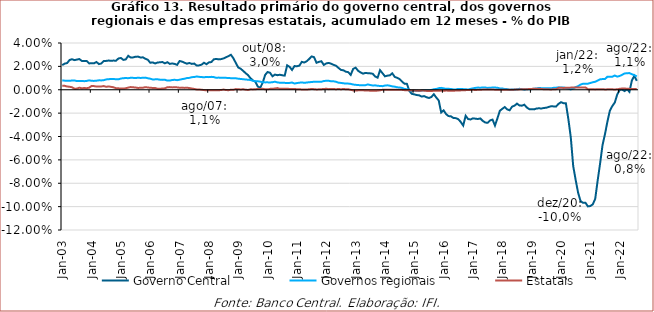
| Category | Governo Central | Governos regionais | Estatais |
|---|---|---|---|
| 2003-01-01 | 0.021 | 0.008 | 0.003 |
| 2003-02-01 | 0.022 | 0.008 | 0.003 |
| 2003-03-01 | 0.023 | 0.008 | 0.003 |
| 2003-04-01 | 0.025 | 0.008 | 0.003 |
| 2003-05-01 | 0.026 | 0.008 | 0.002 |
| 2003-06-01 | 0.025 | 0.008 | 0.001 |
| 2003-07-01 | 0.026 | 0.007 | 0.001 |
| 2003-08-01 | 0.026 | 0.008 | 0.002 |
| 2003-09-01 | 0.025 | 0.008 | 0.001 |
| 2003-10-01 | 0.025 | 0.007 | 0.001 |
| 2003-11-01 | 0.025 | 0.008 | 0.001 |
| 2003-12-01 | 0.023 | 0.008 | 0.002 |
| 2004-01-01 | 0.023 | 0.008 | 0.003 |
| 2004-02-01 | 0.023 | 0.008 | 0.003 |
| 2004-03-01 | 0.024 | 0.008 | 0.003 |
| 2004-04-01 | 0.022 | 0.008 | 0.003 |
| 2004-05-01 | 0.022 | 0.008 | 0.003 |
| 2004-06-01 | 0.025 | 0.008 | 0.003 |
| 2004-07-01 | 0.025 | 0.009 | 0.003 |
| 2004-08-01 | 0.025 | 0.009 | 0.003 |
| 2004-09-01 | 0.025 | 0.009 | 0.002 |
| 2004-10-01 | 0.025 | 0.009 | 0.002 |
| 2004-11-01 | 0.025 | 0.009 | 0.001 |
| 2004-12-01 | 0.027 | 0.009 | 0.001 |
| 2005-01-01 | 0.027 | 0.01 | 0.001 |
| 2005-02-01 | 0.026 | 0.01 | 0.001 |
| 2005-03-01 | 0.026 | 0.01 | 0.001 |
| 2005-04-01 | 0.029 | 0.01 | 0.002 |
| 2005-05-01 | 0.028 | 0.01 | 0.002 |
| 2005-06-01 | 0.028 | 0.01 | 0.002 |
| 2005-07-01 | 0.028 | 0.01 | 0.002 |
| 2005-08-01 | 0.028 | 0.01 | 0.002 |
| 2005-09-01 | 0.028 | 0.01 | 0.002 |
| 2005-10-01 | 0.028 | 0.01 | 0.002 |
| 2005-11-01 | 0.027 | 0.01 | 0.002 |
| 2005-12-01 | 0.026 | 0.01 | 0.002 |
| 2006-01-01 | 0.023 | 0.009 | 0.002 |
| 2006-02-01 | 0.023 | 0.009 | 0.002 |
| 2006-03-01 | 0.023 | 0.009 | 0.002 |
| 2006-04-01 | 0.023 | 0.009 | 0.001 |
| 2006-05-01 | 0.024 | 0.009 | 0.001 |
| 2006-06-01 | 0.024 | 0.008 | 0.001 |
| 2006-07-01 | 0.023 | 0.009 | 0.001 |
| 2006-08-01 | 0.024 | 0.008 | 0.002 |
| 2006-09-01 | 0.022 | 0.008 | 0.002 |
| 2006-10-01 | 0.022 | 0.008 | 0.002 |
| 2006-11-01 | 0.022 | 0.009 | 0.002 |
| 2006-12-01 | 0.021 | 0.008 | 0.002 |
| 2007-01-01 | 0.025 | 0.009 | 0.002 |
| 2007-02-01 | 0.024 | 0.009 | 0.002 |
| 2007-03-01 | 0.023 | 0.009 | 0.002 |
| 2007-04-01 | 0.022 | 0.01 | 0.002 |
| 2007-05-01 | 0.023 | 0.01 | 0.001 |
| 2007-06-01 | 0.022 | 0.011 | 0.001 |
| 2007-07-01 | 0.022 | 0.011 | 0.001 |
| 2007-08-01 | 0.021 | 0.011 | 0 |
| 2007-09-01 | 0.021 | 0.011 | 0 |
| 2007-10-01 | 0.021 | 0.011 | 0 |
| 2007-11-01 | 0.023 | 0.011 | 0 |
| 2007-12-01 | 0.022 | 0.011 | 0 |
| 2008-01-01 | 0.023 | 0.011 | 0 |
| 2008-02-01 | 0.024 | 0.011 | 0 |
| 2008-03-01 | 0.026 | 0.011 | -0.001 |
| 2008-04-01 | 0.026 | 0.01 | -0.001 |
| 2008-05-01 | 0.026 | 0.01 | 0 |
| 2008-06-01 | 0.026 | 0.01 | 0 |
| 2008-07-01 | 0.027 | 0.01 | 0 |
| 2008-08-01 | 0.028 | 0.01 | 0 |
| 2008-09-01 | 0.029 | 0.01 | 0 |
| 2008-10-01 | 0.03 | 0.01 | 0 |
| 2008-11-01 | 0.027 | 0.01 | 0 |
| 2008-12-01 | 0.023 | 0.01 | 0.001 |
| 2009-01-01 | 0.019 | 0.009 | 0 |
| 2009-02-01 | 0.018 | 0.009 | 0 |
| 2009-03-01 | 0.016 | 0.009 | 0 |
| 2009-04-01 | 0.014 | 0.009 | 0 |
| 2009-05-01 | 0.013 | 0.009 | 0 |
| 2009-06-01 | 0.01 | 0.008 | 0 |
| 2009-07-01 | 0.008 | 0.008 | 0 |
| 2009-08-01 | 0.007 | 0.007 | 0 |
| 2009-09-01 | 0.003 | 0.007 | 0.001 |
| 2009-10-01 | 0.002 | 0.007 | 0.001 |
| 2009-11-01 | 0.006 | 0.006 | 0.001 |
| 2009-12-01 | 0.013 | 0.006 | 0 |
| 2010-01-01 | 0.015 | 0.006 | 0 |
| 2010-02-01 | 0.015 | 0.006 | 0.001 |
| 2010-03-01 | 0.012 | 0.006 | 0.001 |
| 2010-04-01 | 0.013 | 0.007 | 0.001 |
| 2010-05-01 | 0.012 | 0.006 | 0.001 |
| 2010-06-01 | 0.013 | 0.006 | 0.001 |
| 2010-07-01 | 0.012 | 0.006 | 0.001 |
| 2010-08-01 | 0.012 | 0.006 | 0.001 |
| 2010-09-01 | 0.021 | 0.006 | 0.001 |
| 2010-10-01 | 0.02 | 0.006 | 0.001 |
| 2010-11-01 | 0.017 | 0.006 | 0.001 |
| 2010-12-01 | 0.02 | 0.005 | 0.001 |
| 2011-01-01 | 0.02 | 0.006 | 0 |
| 2011-02-01 | 0.021 | 0.006 | 0 |
| 2011-03-01 | 0.024 | 0.006 | 0 |
| 2011-04-01 | 0.023 | 0.006 | 0 |
| 2011-05-01 | 0.024 | 0.006 | 0 |
| 2011-06-01 | 0.026 | 0.006 | 0 |
| 2011-07-01 | 0.029 | 0.007 | 0.001 |
| 2011-08-01 | 0.028 | 0.007 | 0.001 |
| 2011-09-01 | 0.023 | 0.007 | 0 |
| 2011-10-01 | 0.024 | 0.007 | 0 |
| 2011-11-01 | 0.024 | 0.007 | 0 |
| 2011-12-01 | 0.021 | 0.008 | 0.001 |
| 2012-01-01 | 0.023 | 0.008 | 0.001 |
| 2012-02-01 | 0.023 | 0.008 | 0.001 |
| 2012-03-01 | 0.022 | 0.007 | 0.001 |
| 2012-04-01 | 0.021 | 0.007 | 0.001 |
| 2012-05-01 | 0.021 | 0.007 | 0 |
| 2012-06-01 | 0.019 | 0.006 | 0.001 |
| 2012-07-01 | 0.017 | 0.006 | 0 |
| 2012-08-01 | 0.017 | 0.006 | 0.001 |
| 2012-09-01 | 0.015 | 0.005 | 0 |
| 2012-10-01 | 0.015 | 0.005 | 0 |
| 2012-11-01 | 0.013 | 0.005 | 0 |
| 2012-12-01 | 0.018 | 0.004 | -0.001 |
| 2013-01-01 | 0.019 | 0.004 | -0.001 |
| 2013-02-01 | 0.016 | 0.004 | -0.001 |
| 2013-03-01 | 0.015 | 0.004 | 0 |
| 2013-04-01 | 0.014 | 0.004 | 0 |
| 2013-05-01 | 0.014 | 0.004 | -0.001 |
| 2013-06-01 | 0.014 | 0.005 | -0.001 |
| 2013-07-01 | 0.014 | 0.004 | -0.001 |
| 2013-08-01 | 0.014 | 0.004 | -0.001 |
| 2013-09-01 | 0.011 | 0.004 | -0.001 |
| 2013-10-01 | 0.01 | 0.003 | -0.001 |
| 2013-11-01 | 0.017 | 0.003 | 0 |
| 2013-12-01 | 0.014 | 0.003 | 0 |
| 2014-01-01 | 0.011 | 0.004 | 0 |
| 2014-02-01 | 0.012 | 0.004 | 0 |
| 2014-03-01 | 0.012 | 0.003 | 0 |
| 2014-04-01 | 0.014 | 0.003 | 0 |
| 2014-05-01 | 0.011 | 0.003 | 0 |
| 2014-06-01 | 0.01 | 0.002 | 0 |
| 2014-07-01 | 0.009 | 0.002 | 0 |
| 2014-08-01 | 0.007 | 0.002 | 0 |
| 2014-09-01 | 0.005 | 0.001 | 0 |
| 2014-10-01 | 0.005 | 0 | 0 |
| 2014-11-01 | -0.001 | 0 | 0 |
| 2014-12-01 | -0.004 | -0.001 | -0.001 |
| 2015-01-01 | -0.004 | -0.001 | -0.001 |
| 2015-02-01 | -0.005 | -0.001 | -0.001 |
| 2015-03-01 | -0.005 | -0.001 | -0.001 |
| 2015-04-01 | -0.006 | -0.001 | -0.001 |
| 2015-05-01 | -0.005 | 0 | -0.001 |
| 2015-06-01 | -0.006 | 0 | -0.001 |
| 2015-07-01 | -0.007 | -0.001 | -0.001 |
| 2015-08-01 | -0.006 | 0 | -0.001 |
| 2015-09-01 | -0.004 | 0 | -0.001 |
| 2015-10-01 | -0.007 | 0.001 | -0.001 |
| 2015-11-01 | -0.009 | 0.001 | -0.001 |
| 2015-12-01 | -0.019 | 0.002 | -0.001 |
| 2016-01-01 | -0.018 | 0.001 | -0.001 |
| 2016-02-01 | -0.021 | 0.001 | -0.001 |
| 2016-03-01 | -0.023 | 0.001 | -0.001 |
| 2016-04-01 | -0.023 | 0.001 | -0.001 |
| 2016-05-01 | -0.024 | 0 | -0.001 |
| 2016-06-01 | -0.024 | 0 | -0.001 |
| 2016-07-01 | -0.025 | 0.001 | -0.001 |
| 2016-08-01 | -0.028 | 0.001 | -0.001 |
| 2016-09-01 | -0.031 | 0.001 | 0 |
| 2016-10-01 | -0.022 | 0 | 0 |
| 2016-11-01 | -0.025 | 0 | 0 |
| 2016-12-01 | -0.025 | 0.001 | 0 |
| 2017-01-01 | -0.024 | 0.001 | 0 |
| 2017-02-01 | -0.025 | 0.002 | 0 |
| 2017-03-01 | -0.025 | 0.002 | 0 |
| 2017-04-01 | -0.025 | 0.002 | 0 |
| 2017-05-01 | -0.027 | 0.002 | 0 |
| 2017-06-01 | -0.028 | 0.002 | 0 |
| 2017-07-01 | -0.028 | 0.002 | 0 |
| 2017-08-01 | -0.026 | 0.002 | 0 |
| 2017-09-01 | -0.026 | 0.002 | 0 |
| 2017-10-01 | -0.031 | 0.002 | 0 |
| 2017-11-01 | -0.024 | 0.002 | 0 |
| 2017-12-01 | -0.018 | 0.001 | 0 |
| 2018-01-01 | -0.016 | 0.001 | 0 |
| 2018-02-01 | -0.015 | 0.001 | 0 |
| 2018-03-01 | -0.017 | 0.001 | 0 |
| 2018-04-01 | -0.018 | 0 | 0 |
| 2018-05-01 | -0.014 | 0 | 0 |
| 2018-06-01 | -0.014 | 0 | 0 |
| 2018-07-01 | -0.012 | 0 | 0 |
| 2018-08-01 | -0.013 | 0.001 | 0 |
| 2018-09-01 | -0.014 | 0.001 | 0 |
| 2018-10-01 | -0.013 | 0 | 0.001 |
| 2018-11-01 | -0.015 | 0 | 0 |
| 2018-12-01 | -0.017 | 0 | 0.001 |
| 2019-01-01 | -0.017 | 0.001 | 0.001 |
| 2019-02-01 | -0.017 | 0.001 | 0.001 |
| 2019-03-01 | -0.016 | 0.001 | 0.001 |
| 2019-04-01 | -0.016 | 0.002 | 0.001 |
| 2019-05-01 | -0.016 | 0.001 | 0.001 |
| 2019-06-01 | -0.016 | 0.001 | 0 |
| 2019-07-01 | -0.015 | 0.001 | 0 |
| 2019-08-01 | -0.015 | 0.001 | 0 |
| 2019-09-01 | -0.014 | 0.001 | 0 |
| 2019-10-01 | -0.014 | 0.002 | 0 |
| 2019-11-01 | -0.014 | 0.002 | 0 |
| 2019-12-01 | -0.012 | 0.002 | 0.002 |
| 2020-01-01 | -0.011 | 0.002 | 0.002 |
| 2020-02-01 | -0.011 | 0.002 | 0.002 |
| 2020-03-01 | -0.012 | 0.001 | 0.002 |
| 2020-04-01 | -0.025 | 0.001 | 0.002 |
| 2020-05-01 | -0.04 | 0 | 0.002 |
| 2020-06-01 | -0.065 | 0.001 | 0.002 |
| 2020-07-01 | -0.077 | 0.002 | 0.002 |
| 2020-08-01 | -0.088 | 0.003 | 0.002 |
| 2020-09-01 | -0.095 | 0.004 | 0.002 |
| 2020-10-01 | -0.097 | 0.005 | 0.002 |
| 2020-11-01 | -0.097 | 0.005 | 0.002 |
| 2020-12-01 | -0.1 | 0.005 | 0 |
| 2021-01-01 | -0.1 | 0.006 | 0 |
| 2021-02-01 | -0.098 | 0.006 | 0 |
| 2021-03-01 | -0.093 | 0.007 | 0 |
| 2021-04-01 | -0.078 | 0.008 | 0 |
| 2021-05-01 | -0.063 | 0.009 | 0 |
| 2021-06-01 | -0.047 | 0.009 | 0 |
| 2021-07-01 | -0.038 | 0.009 | 0 |
| 2021-08-01 | -0.027 | 0.011 | 0 |
| 2021-09-01 | -0.018 | 0.011 | 0 |
| 2021-10-01 | -0.014 | 0.011 | 0 |
| 2021-11-01 | -0.011 | 0.012 | 0 |
| 2021-12-01 | -0.004 | 0.011 | 0 |
| 2022-01-01 | 0 | 0.012 | 0.001 |
| 2022-02-01 | 0 | 0.013 | 0.001 |
| 2022-03-01 | -0.001 | 0.014 | 0.001 |
| 2022-04-01 | 0 | 0.014 | 0.001 |
| 2022-05-01 | -0.002 | 0.014 | 0.001 |
| 2022-06-01 | 0.008 | 0.013 | 0.001 |
| 2022-07-01 | 0.012 | 0.013 | 0.001 |
| 2022-08-01 | 0.008 | 0.011 | 0.001 |